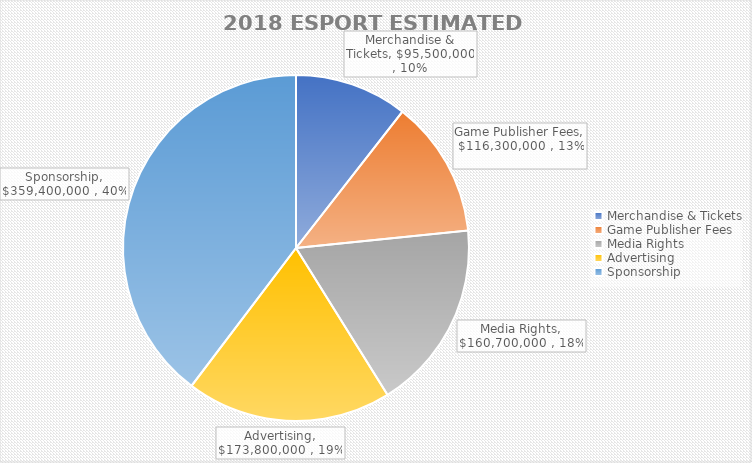
| Category | Series 0 |
|---|---|
| Merchandise & Tickets | 95500000 |
| Game Publisher Fees | 116300000 |
| Media Rights | 160700000 |
| Advertising | 173800000 |
| Sponsorship | 359400000 |